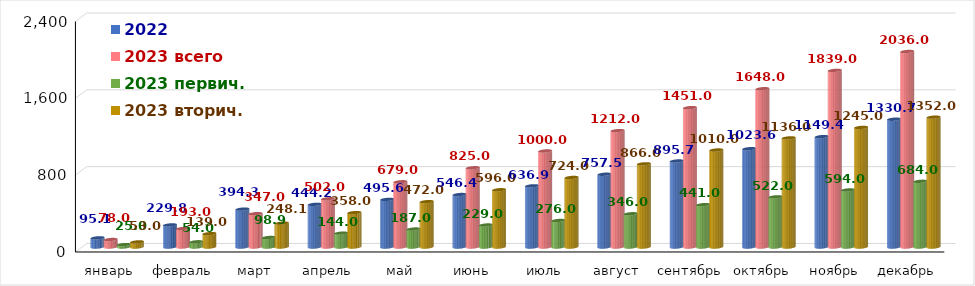
| Category | 2022 | 2023 всего | 2023 первич. | 2023 вторич. |
|---|---|---|---|---|
| январь | 95.122 | 78 | 25 | 53 |
| февраль | 229.762 | 193 | 54 | 139 |
| март | 394.318 | 347 | 98.9 | 248.1 |
| апрель | 444.248 | 502 | 144 | 358 |
| май | 495.62 | 679 | 187 | 472 |
| июнь | 546.358 | 825 | 229 | 596 |
| июль | 636.943 | 1000 | 276 | 724 |
| август | 757.5 | 1212 | 346 | 866 |
| сентябрь | 895.679 | 1451 | 441 | 1010 |
| октябрь | 1023.602 | 1648 | 522 | 1136 |
| ноябрь | 1149.375 | 1839 | 594 | 1245 |
| декабрь | 1330.719 | 2036 | 684 | 1352 |